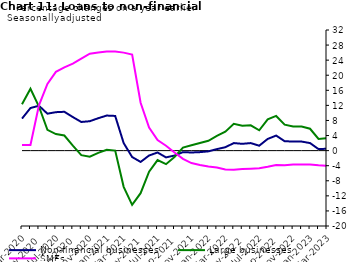
| Category | zero | Non-financial businesses | Large businesses | SMEs |
|---|---|---|---|---|
| Mar-2020 | 0 | 8.5 | 12.3 | 1.5 |
| Apr-2020 | 0 | 11.3 | 16.4 | 1.5 |
| May-2020 | 0 | 11.9 | 11.7 | 12 |
| Jun-2020 | 0 | 9.8 | 5.5 | 17.7 |
| Jul-2020 | 0 | 10.2 | 4.4 | 20.9 |
| Aug-2020 | 0 | 10.3 | 4 | 22.1 |
| Sep-2020 | 0 | 8.9 | 1.3 | 23.1 |
| Oct-2020 | 0 | 7.6 | -1.2 | 24.4 |
| Nov-2020 | 0 | 7.8 | -1.6 | 25.7 |
| Dec-2020 | 0 | 8.6 | -0.6 | 26 |
| Jan-2021 | 0 | 9.3 | 0.2 | 26.3 |
| Feb-2021 | 0 | 9.2 | 0 | 26.3 |
| Mar-2021 | 0 | 2 | -9.6 | 26 |
| Apr-2021 | 0 | -1.7 | -14.4 | 25.5 |
| May-2021 | 0 | -3 | -11.3 | 12.7 |
| Jun-2021 | 0 | -1.3 | -5.6 | 6.1 |
| Jul-2021 | 0 | -0.5 | -2.5 | 2.8 |
| Aug-2021 | 0 | -1.8 | -3.6 | 1.3 |
| Sep-2021 | 0 | -1.3 | -1.7 | -0.5 |
| Oct-2021 | 0 | -0.4 | 0.8 | -2.2 |
| Nov-2021 | 0 | -0.5 | 1.4 | -3.3 |
| Dec-2021 | 0 | -0.4 | 2 | -3.8 |
| Jan-2022 | 0 | -0.2 | 2.6 | -4.2 |
| Feb-2022 | 0 | 0.4 | 3.9 | -4.5 |
| Mar-2022 | 0 | 0.9 | 5 | -5 |
| Apr-2022 | 0 | 2 | 7.1 | -5.1 |
| May-2022 | 0 | 1.8 | 6.6 | -4.9 |
| Jun-2022 | 0 | 2 | 6.7 | -4.8 |
| Jul-2022 | 0 | 1.3 | 5.4 | -4.7 |
| Aug-2022 | 0 | 3.1 | 8.3 | -4.3 |
| Sep-2022 | 0 | 4 | 9.2 | -3.8 |
| Oct-2022 | 0 | 2.5 | 6.9 | -3.9 |
| Nov-2022 | 0 | 2.4 | 6.4 | -3.7 |
| Dec-2022 | 0 | 2.4 | 6.4 | -3.7 |
| Jan-2023 | 0 | 2 | 5.8 | -3.7 |
| Feb-2023 | 0 | 0.4 | 3.1 | -3.9 |
| Mar-2023 | 0 | 0.5 | 3.3 | -4 |